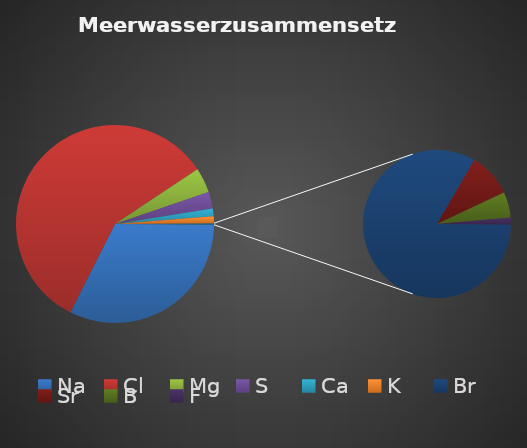
| Category | Series 0 |
|---|---|
| Na | 10878 |
| Cl | 19596 |
| Mg | 1375 |
| S | 921 |
| Ca | 424 |
| K | 380 |
| Br | 70.2 |
| Sr | 8.09 |
| B | 4.7 |
| F | 1.3 |